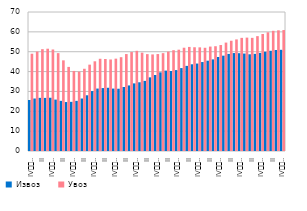
| Category | Извоз  | Увоз  |
|---|---|---|
| IV
2007. | 25.685 | 48.988 |
| I | 26.435 | 50.079 |
| II | 26.762 | 51.284 |
| III | 26.745 | 51.516 |
| IV
2008. | 26.815 | 51.116 |
| I | 25.895 | 49.29 |
| II | 25.249 | 45.652 |
| III | 24.656 | 42.354 |
| IV
2009. | 24.756 | 40.32 |
| I | 25.245 | 39.961 |
| II | 26.435 | 41.413 |
| III | 28.059 | 43.49 |
| IV
2010. | 30.174 | 45.17 |
| I | 31.45 | 46.443 |
| II | 31.688 | 46.344 |
| III | 31.841 | 46.086 |
| IV
2011. | 31.438 | 46.506 |
| I | 31.357 | 47.241 |
| II | 32.233 | 48.822 |
| III | 33.016 | 49.83 |
| IV
2012. | 34.052 | 50.45 |
| I | 34.607 | 49.528 |
| II | 35.308 | 48.789 |
| III | 37.081 | 48.635 |
| IV
2013. | 38.263 | 48.82 |
| I | 39.61 | 49.276 |
| II | 40.486 | 50.052 |
| III | 40.292 | 50.758 |
| IV
2014. | 40.743 | 51.021 |
| I | 41.753 | 52.012 |
| II | 42.869 | 52.412 |
| III | 43.67 | 52.242 |
| IV
2015. | 44.034 | 52.197 |
| I | 44.801 | 51.988 |
| II | 45.482 | 52.59 |
| III | 46.131 | 52.766 |
| IV
2016. | 47.342 | 53.366 |
| I | 48.013 | 54.597 |
| II | 48.893 | 55.523 |
| III | 49.328 | 56.197 |
| IV
2017. | 49.247 | 56.977 |
| I | 49.074 | 57.099 |
| II | 48.705 | 56.986 |
| III | 48.928 | 57.846 |
| IV
2018. | 49.389 | 58.934 |
| I | 49.984 | 59.799 |
| II | 50.47 | 60.53 |
| III | 50.867 | 60.782 |
| IV
2019. | 50.962 | 60.91 |